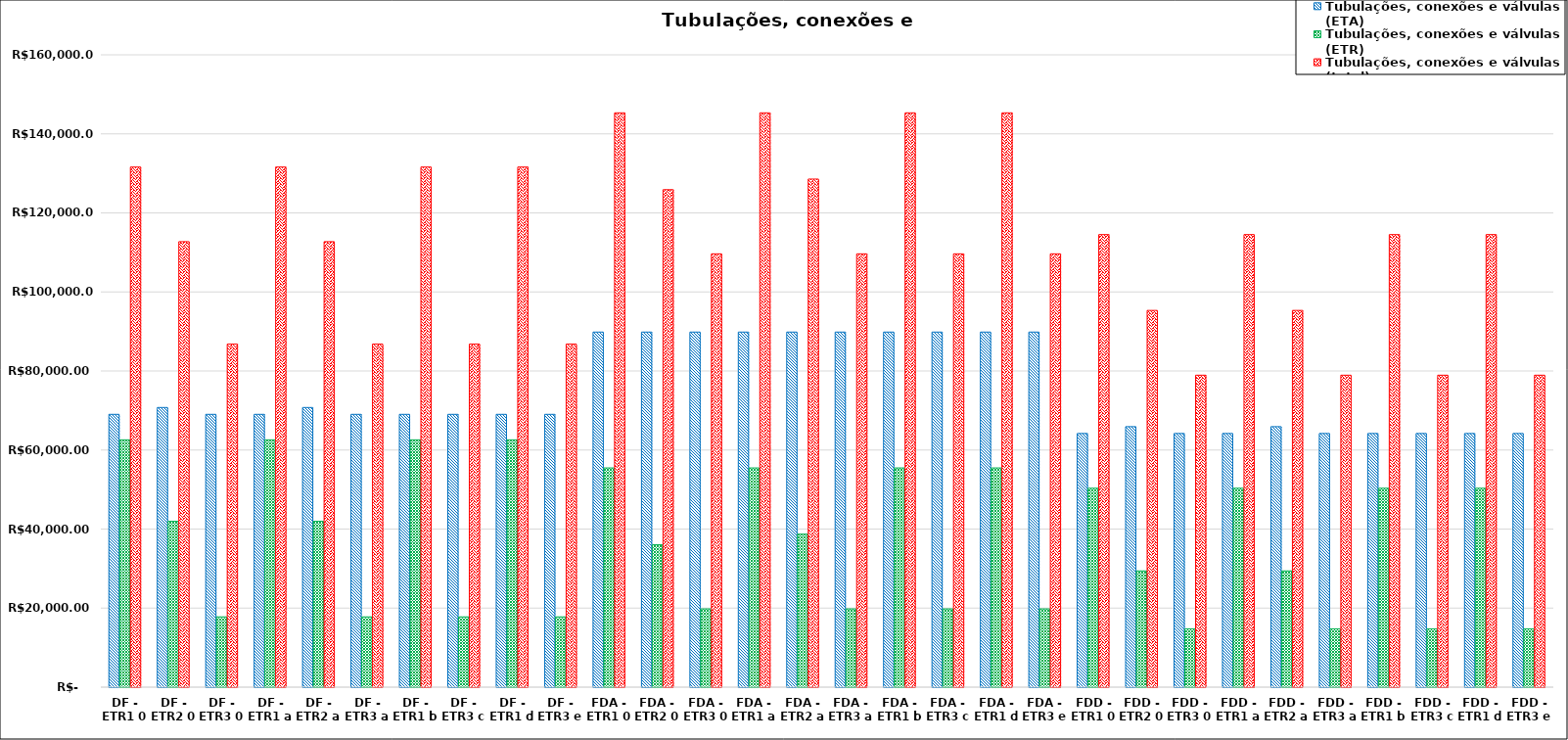
| Category | Tubulações, conexões e válvulas (ETA) | Tubulações, conexões e válvulas (ETR) | Tubulações, conexões e válvulas (total) |
|---|---|---|---|
| DF - ETR1 0 | 69027.24 | 62577.1 | 131604.34 |
| DF - ETR2 0 | 70756.44 | 41960.98 | 112717.42 |
| DF - ETR3 0 | 69027.24 | 17775.52 | 86802.76 |
| DF - ETR1 a | 69027.24 | 62577.1 | 131604.34 |
| DF - ETR2 a | 70756.44 | 41960.98 | 112717.42 |
| DF - ETR3 a | 69027.24 | 17775.52 | 86802.76 |
| DF - ETR1 b | 69027.24 | 62577.1 | 131604.34 |
| DF - ETR3 c | 69027.24 | 17775.52 | 86802.76 |
| DF - ETR1 d | 69027.24 | 62577.1 | 131604.34 |
| DF - ETR3 e | 69027.24 | 17775.52 | 86802.76 |
| FDA - ETR1 0 | 89842.57 | 55467.28 | 145309.85 |
| FDA - ETR2 0 | 89842.57 | 36025.72 | 125868.29 |
| FDA - ETR3 0 | 89842.57 | 19795.5 | 109638.07 |
| FDA - ETR1 a | 89842.57 | 55467.28 | 145309.85 |
| FDA - ETR2 a | 89842.57 | 38711.5 | 128554.07 |
| FDA - ETR3 a | 89842.57 | 19795.5 | 109638.07 |
| FDA - ETR1 b | 89842.57 | 55467.28 | 145309.85 |
| FDA - ETR3 c | 89842.57 | 19795.5 | 109638.07 |
| FDA - ETR1 d | 89842.57 | 55467.28 | 145309.85 |
| FDA - ETR3 e | 89842.57 | 19795.5 | 109638.07 |
| FDD - ETR1 0 | 64180.31 | 50324.54 | 114504.85 |
| FDD - ETR2 0 | 65909.51 | 29410.25 | 95319.76 |
| FDD - ETR3 0 | 64180.31 | 14749.97 | 78930.28 |
| FDD - ETR1 a | 64180.31 | 50324.54 | 114504.85 |
| FDD - ETR2 a | 65909.51 | 29410.25 | 95319.76 |
| FDD - ETR3 a | 64180.31 | 14749.97 | 78930.28 |
| FDD - ETR1 b | 64180.31 | 50324.54 | 114504.85 |
| FDD - ETR3 c | 64180.31 | 14749.97 | 78930.28 |
| FDD - ETR1 d | 64180.31 | 50324.54 | 114504.85 |
| FDD - ETR3 e | 64180.31 | 14749.97 | 78930.28 |